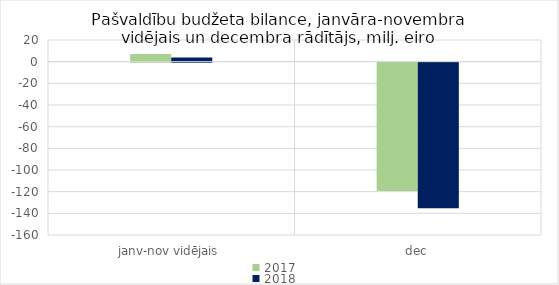
| Category | 2017 | 2018 |
|---|---|---|
| janv-nov vidējais | 7180.676 | 3940.636 |
| dec | -118383.812 | -134394.788 |